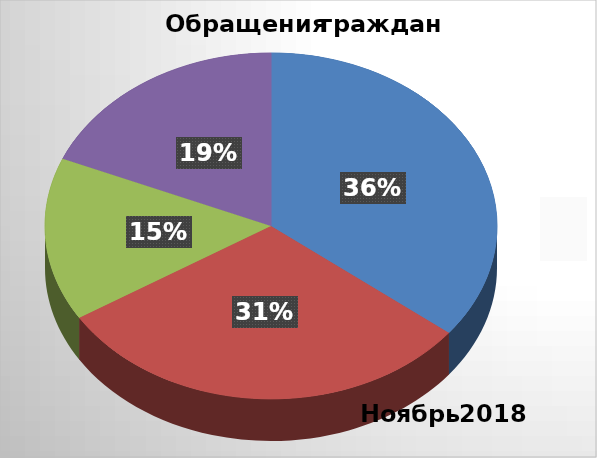
| Category | Series 0 |
|---|---|
| ЗВО | 21 |
| ЦВО | 18 |
| ЮВО | 9 |
| ВВО | 11 |